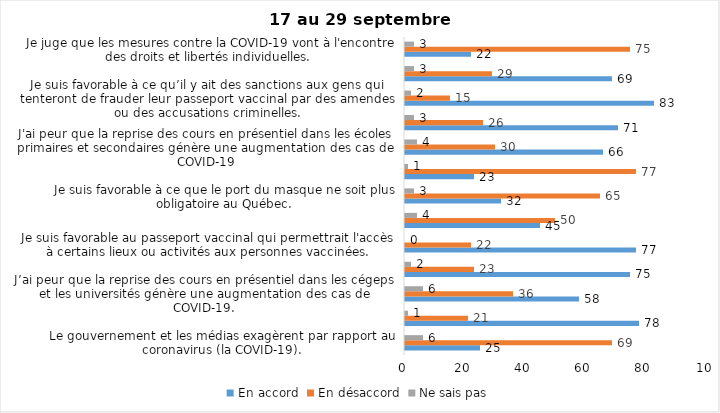
| Category | En accord | En désaccord | Ne sais pas |
|---|---|---|---|
| Le gouvernement et les médias exagèrent par rapport au coronavirus (la COVID-19). | 25 | 69 | 6 |
| J’ai peur que le système de santé soit débordé par les cas de COVID-19. | 78 | 21 | 1 |
| J’ai peur que la reprise des cours en présentiel dans les cégeps et les universités génère une augmentation des cas de COVID-19. | 58 | 36 | 6 |
| Je suis inquiet/inquiète  que le nombre de cas augmente en raison des nouveaux variants du virus de la COVID-19 | 75 | 23 | 2 |
| Je suis favorable au passeport vaccinal qui permettrait l'accès à certains lieux ou activités aux personnes vaccinées. | 77 | 22 | 0 |
| Si les cas de COVID-19 augmentent cet automne, je suis favorable à la mise en place de mesures de confinement (ex. fermeture de services non essentiels, interdiction des rassemblements privés) | 45 | 50 | 4 |
| Je suis favorable à ce que le port du masque ne soit plus obligatoire au Québec. | 32 | 65 | 3 |
| Étant donné la progression de la vaccination, je pense qu’il est moins important de suivre les mesures de prévention. | 23 | 77 | 1 |
| J'ai peur que la reprise des cours en présentiel dans les écoles primaires et secondaires génère une augmentation des cas de COVID-19 | 66 | 30 | 4 |
| Je suis favorable à ce qu’il y ait des sanctions aux commerçants qui ne vérifieront pas le passeport vaccinal (code QR) de leurs clients | 71 | 26 | 3 |
| Je suis favorable à ce qu’il y ait des sanctions aux gens qui tenteront de frauder leur passeport vaccinal par des amendes ou des accusations criminelles. | 83 | 15 | 2 |
| Je crois que le passeport vaccinal devrait être requis pour davantage de services et commerces (ex. : spas, centre d’achats, centre de soins personnels. | 69 | 29 | 3 |
| Je juge que les mesures contre la COVID-19 vont à l'encontre des droits et libertés individuelles.  | 22 | 75 | 3 |